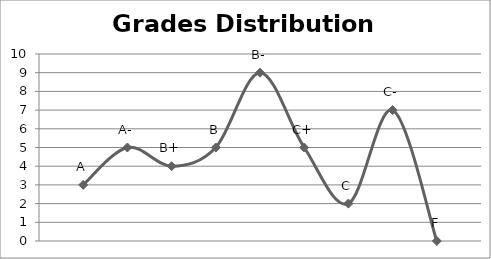
| Category | Series 0 |
|---|---|
| 0 | 3 |
| 1 | 5 |
| 2 | 4 |
| 3 | 5 |
| 4 | 9 |
| 5 | 5 |
| 6 | 2 |
| 7 | 7 |
| 8 | 0 |